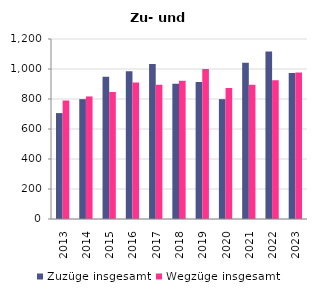
| Category | Zuzüge insgesamt | Wegzüge insgesamt |
|---|---|---|
| 2013.0 | 706 | 790 |
| 2014.0 | 799 | 817 |
| 2015.0 | 949 | 847 |
| 2016.0 | 985 | 910 |
| 2017.0 | 1033 | 895 |
| 2018.0 | 901 | 922 |
| 2019.0 | 913 | 1000 |
| 2020.0 | 799 | 874 |
| 2021.0 | 1042 | 895 |
| 2022.0 | 1117 | 925 |
| 2023.0 | 973 | 976 |